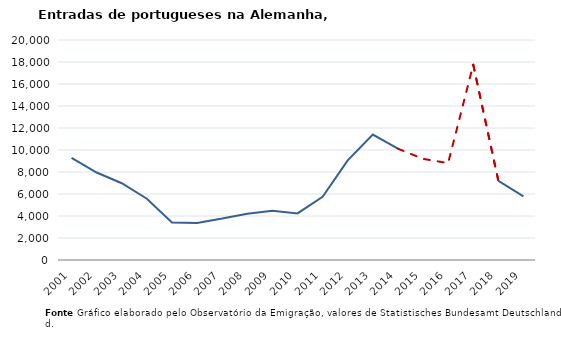
| Category | Entradas |
|---|---|
| 2001.0 | 9287 |
| 2002.0 | 7955 |
| 2003.0 | 6981 |
| 2004.0 | 5570 |
| 2005.0 | 3418 |
| 2006.0 | 3371 |
| 2007.0 | 3766 |
| 2008.0 | 4214 |
| 2009.0 | 4468 |
| 2010.0 | 4238 |
| 2011.0 | 5752 |
| 2012.0 | 9054 |
| 2013.0 | 11401 |
| 2014.0 | 10121 |
| 2015.0 | 9195 |
| 2016.0 | 8810 |
| 2017.0 | 17750 |
| 2018.0 | 7200 |
| 2019.0 | 5785 |